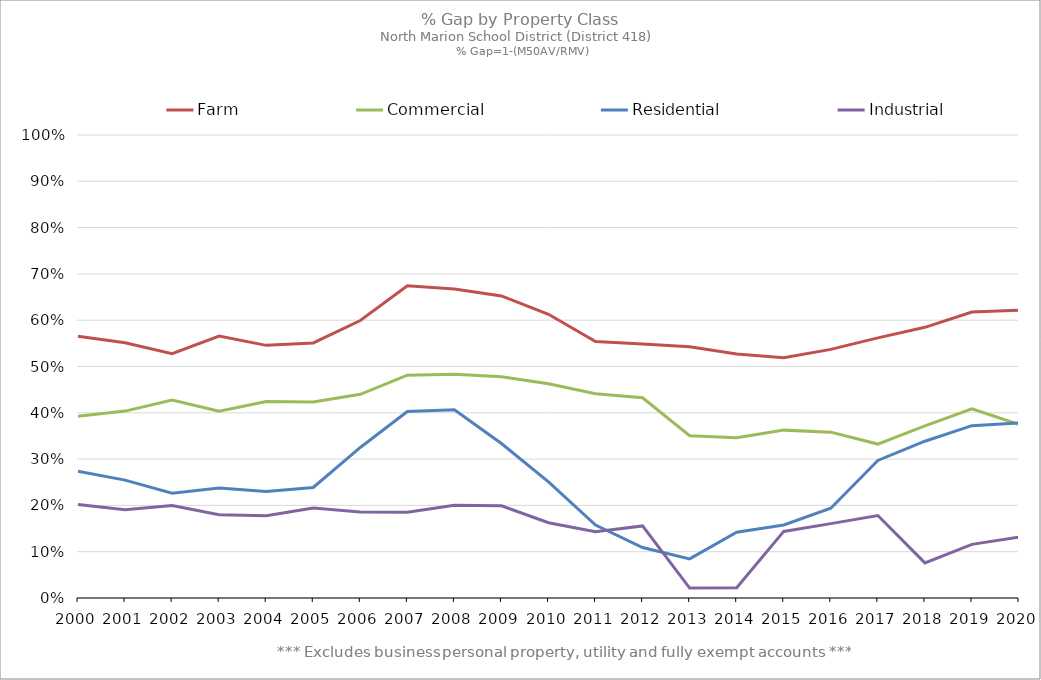
| Category | Farm | Commercial | Residential | Industrial |
|---|---|---|---|---|
| 2000.0 | 0.566 | 0.392 | 0.274 | 0.202 |
| 2001.0 | 0.551 | 0.404 | 0.255 | 0.191 |
| 2002.0 | 0.528 | 0.427 | 0.226 | 0.2 |
| 2003.0 | 0.566 | 0.404 | 0.238 | 0.18 |
| 2004.0 | 0.546 | 0.425 | 0.23 | 0.178 |
| 2005.0 | 0.551 | 0.423 | 0.239 | 0.194 |
| 2006.0 | 0.599 | 0.44 | 0.325 | 0.186 |
| 2007.0 | 0.674 | 0.481 | 0.403 | 0.185 |
| 2008.0 | 0.667 | 0.483 | 0.407 | 0.2 |
| 2009.0 | 0.652 | 0.478 | 0.334 | 0.199 |
| 2010.0 | 0.613 | 0.463 | 0.251 | 0.163 |
| 2011.0 | 0.554 | 0.441 | 0.158 | 0.143 |
| 2012.0 | 0.548 | 0.432 | 0.109 | 0.156 |
| 2013.0 | 0.543 | 0.35 | 0.084 | 0.021 |
| 2014.0 | 0.527 | 0.346 | 0.142 | 0.022 |
| 2015.0 | 0.519 | 0.363 | 0.158 | 0.144 |
| 2016.0 | 0.537 | 0.358 | 0.194 | 0.161 |
| 2017.0 | 0.562 | 0.332 | 0.297 | 0.178 |
| 2018.0 | 0.585 | 0.372 | 0.339 | 0.076 |
| 2019.0 | 0.618 | 0.409 | 0.372 | 0.116 |
| 2020.0 | 0.622 | 0.375 | 0.378 | 0.132 |